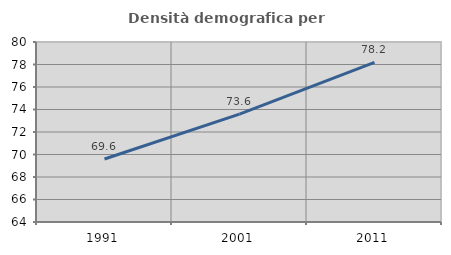
| Category | Densità demografica |
|---|---|
| 1991.0 | 69.597 |
| 2001.0 | 73.595 |
| 2011.0 | 78.185 |